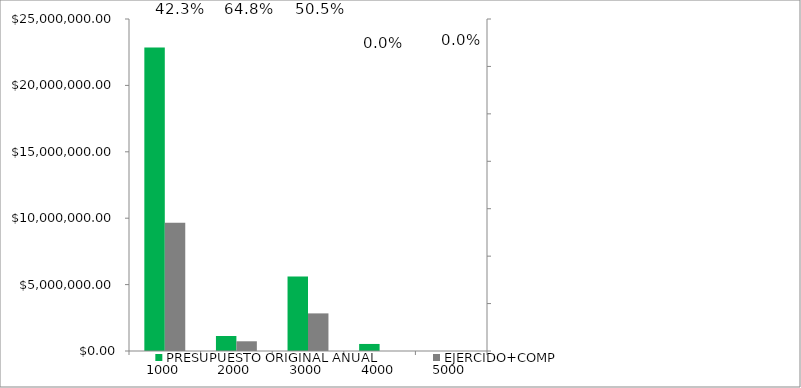
| Category | PRESUPUESTO ORIGINAL ANUAL | EJERCIDO+COMP |
|---|---|---|
| 1000.0 | 22862456 | 9659718.86 |
| 2000.0 | 1128884 | 731547.98 |
| 3000.0 | 5604895 | 2832351.35 |
| 4000.0 | 530650 | 0 |
| 5000.0 | 0 | 0 |